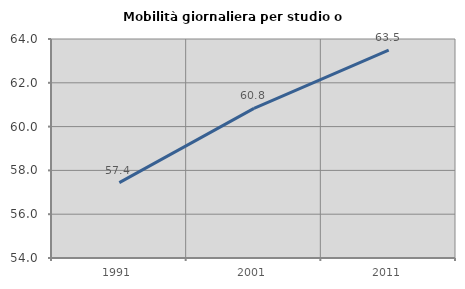
| Category | Mobilità giornaliera per studio o lavoro |
|---|---|
| 1991.0 | 57.443 |
| 2001.0 | 60.833 |
| 2011.0 | 63.491 |